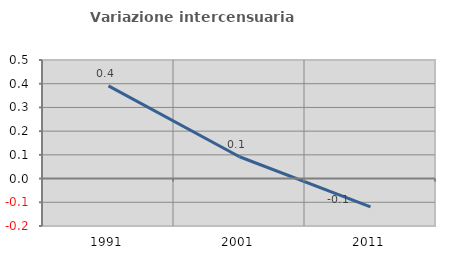
| Category | Variazione intercensuaria annua |
|---|---|
| 1991.0 | 0.391 |
| 2001.0 | 0.092 |
| 2011.0 | -0.119 |